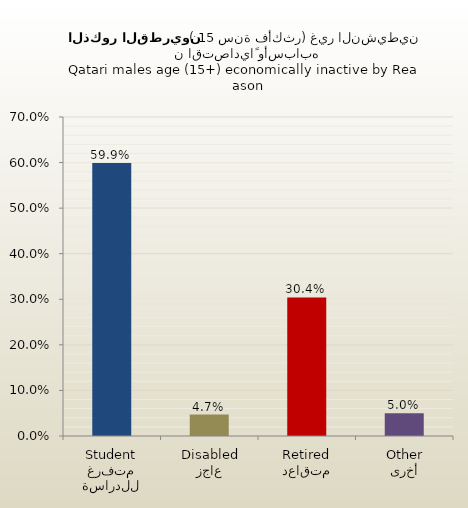
| Category | الذكور القطريين |
|---|---|
| متفرغ للدراسة
Student | 0.599 |
| عاجز
Disabled | 0.047 |
| متقاعد
Retired | 0.304 |
| أخرى
Other | 0.05 |